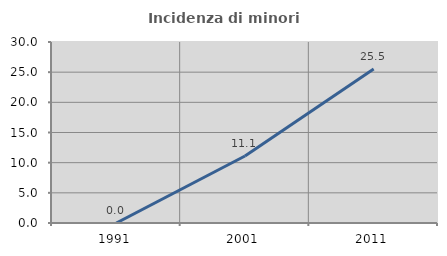
| Category | Incidenza di minori stranieri |
|---|---|
| 1991.0 | 0 |
| 2001.0 | 11.111 |
| 2011.0 | 25.532 |